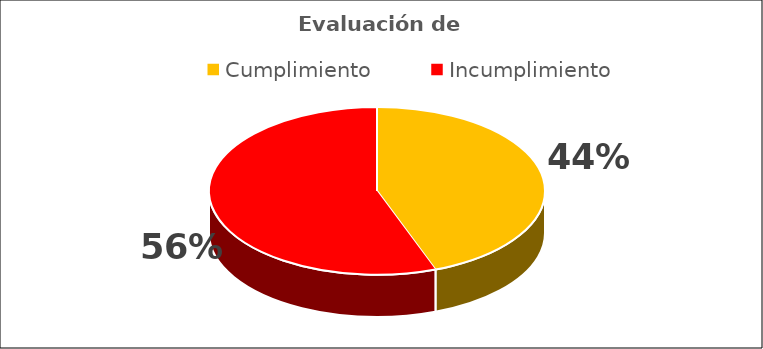
| Category | Series 0 |
|---|---|
| Cumplimiento | 0.443 |
| Incumplimiento | 0.557 |